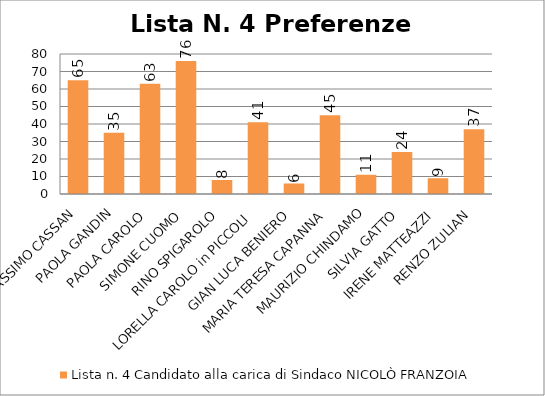
| Category | Lista n. 4 Candidato alla carica di Sindaco NICOLÒ FRANZOIA |
|---|---|
| MASSIMO CASSAN | 65 |
| PAOLA GANDIN | 35 |
| PAOLA CAROLO | 63 |
| SIMONE CUOMO | 76 |
| RINO SPIGAROLO | 8 |
| LORELLA CAROLO in PICCOLI | 41 |
| GIAN LUCA BENIERO | 6 |
| MARIA TERESA CAPANNA | 45 |
| MAURIZIO CHINDAMO | 11 |
| SILVIA GATTO | 24 |
| IRENE MATTEAZZI | 9 |
| RENZO ZULIAN | 37 |